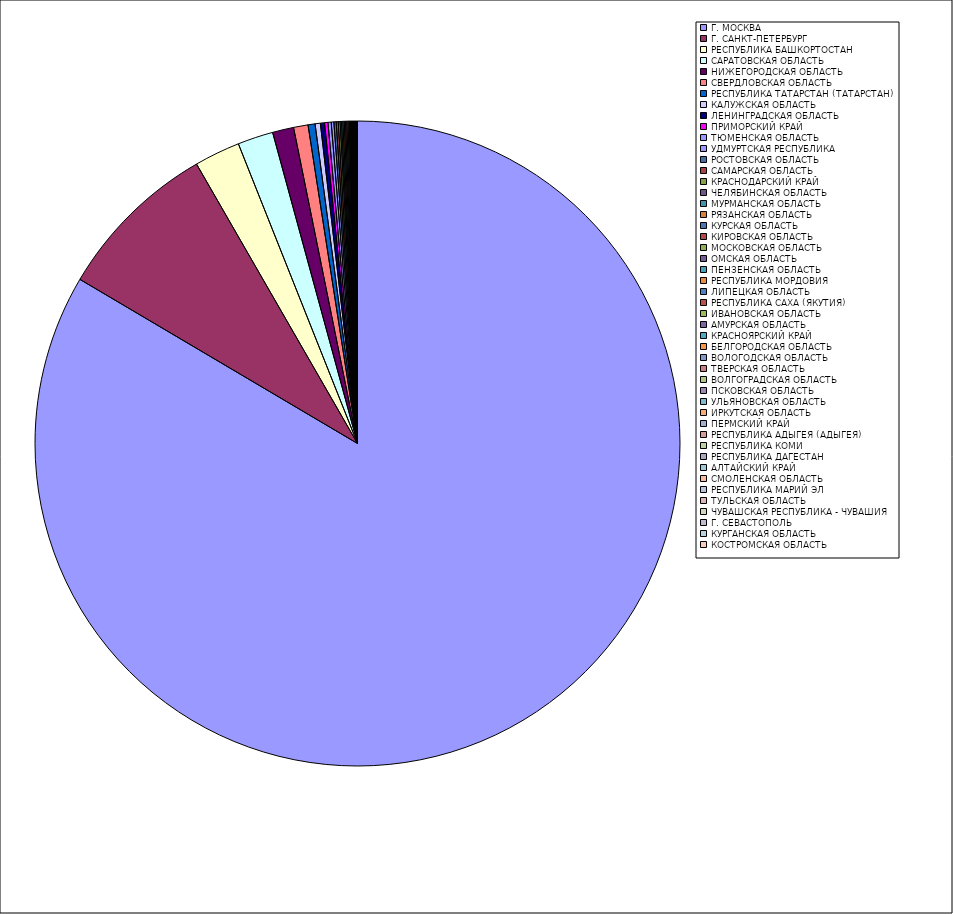
| Category | Оборот |
|---|---|
| Г. МОСКВА | 83.474 |
| Г. САНКТ-ПЕТЕРБУРГ | 8.182 |
| РЕСПУБЛИКА БАШКОРТОСТАН | 2.295 |
| САРАТОВСКАЯ ОБЛАСТЬ | 1.781 |
| НИЖЕГОРОДСКАЯ ОБЛАСТЬ | 1.061 |
| СВЕРДЛОВСКАЯ ОБЛАСТЬ | 0.726 |
| РЕСПУБЛИКА ТАТАРСТАН (ТАТАРСТАН) | 0.35 |
| КАЛУЖСКАЯ ОБЛАСТЬ | 0.264 |
| ЛЕНИНГРАДСКАЯ ОБЛАСТЬ | 0.206 |
| ПРИМОРСКИЙ КРАЙ | 0.17 |
| ТЮМЕНСКАЯ ОБЛАСТЬ | 0.162 |
| УДМУРТСКАЯ РЕСПУБЛИКА | 0.132 |
| РОСТОВСКАЯ ОБЛАСТЬ | 0.114 |
| САМАРСКАЯ ОБЛАСТЬ | 0.102 |
| КРАСНОДАРСКИЙ КРАЙ | 0.09 |
| ЧЕЛЯБИНСКАЯ ОБЛАСТЬ | 0.071 |
| МУРМАНСКАЯ ОБЛАСТЬ | 0.068 |
| РЯЗАНСКАЯ ОБЛАСТЬ | 0.065 |
| КУРСКАЯ ОБЛАСТЬ | 0.064 |
| КИРОВСКАЯ ОБЛАСТЬ | 0.063 |
| МОСКОВСКАЯ ОБЛАСТЬ | 0.061 |
| ОМСКАЯ ОБЛАСТЬ | 0.057 |
| ПЕНЗЕНСКАЯ ОБЛАСТЬ | 0.037 |
| РЕСПУБЛИКА МОРДОВИЯ | 0.034 |
| ЛИПЕЦКАЯ ОБЛАСТЬ | 0.034 |
| РЕСПУБЛИКА САХА (ЯКУТИЯ) | 0.033 |
| ИВАНОВСКАЯ ОБЛАСТЬ | 0.03 |
| АМУРСКАЯ ОБЛАСТЬ | 0.025 |
| КРАСНОЯРСКИЙ КРАЙ | 0.023 |
| БЕЛГОРОДСКАЯ ОБЛАСТЬ | 0.022 |
| ВОЛОГОДСКАЯ ОБЛАСТЬ | 0.02 |
| ТВЕРСКАЯ ОБЛАСТЬ | 0.015 |
| ВОЛГОГРАДСКАЯ ОБЛАСТЬ | 0.014 |
| ПСКОВСКАЯ ОБЛАСТЬ | 0.013 |
| УЛЬЯНОВСКАЯ ОБЛАСТЬ | 0.013 |
| ИРКУТСКАЯ ОБЛАСТЬ | 0.011 |
| ПЕРМСКИЙ КРАЙ | 0.01 |
| РЕСПУБЛИКА АДЫГЕЯ (АДЫГЕЯ) | 0.01 |
| РЕСПУБЛИКА КОМИ | 0.01 |
| РЕСПУБЛИКА ДАГЕСТАН | 0.008 |
| АЛТАЙСКИЙ КРАЙ | 0.007 |
| СМОЛЕНСКАЯ ОБЛАСТЬ | 0.007 |
| РЕСПУБЛИКА МАРИЙ ЭЛ | 0.007 |
| ТУЛЬСКАЯ ОБЛАСТЬ | 0.007 |
| ЧУВАШСКАЯ РЕСПУБЛИКА - ЧУВАШИЯ | 0.006 |
| Г. СЕВАСТОПОЛЬ | 0.006 |
| КУРГАНСКАЯ ОБЛАСТЬ | 0.006 |
| КОСТРОМСКАЯ ОБЛАСТЬ | 0.005 |